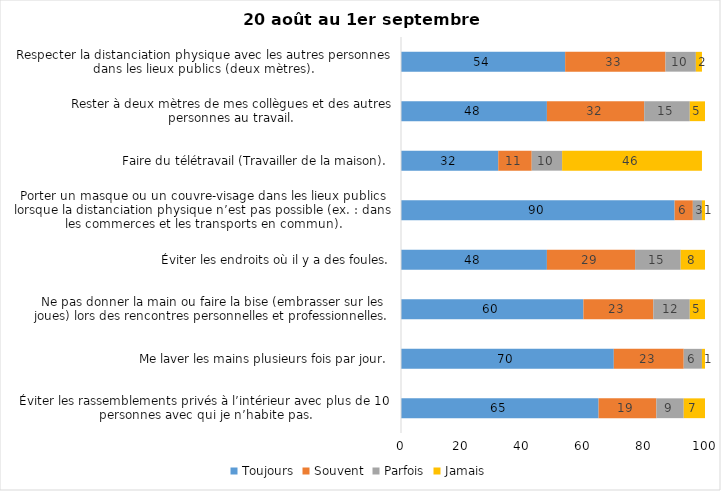
| Category | Toujours | Souvent | Parfois | Jamais |
|---|---|---|---|---|
| Éviter les rassemblements privés à l’intérieur avec plus de 10 personnes avec qui je n’habite pas. | 65 | 19 | 9 | 7 |
| Me laver les mains plusieurs fois par jour. | 70 | 23 | 6 | 1 |
| Ne pas donner la main ou faire la bise (embrasser sur les joues) lors des rencontres personnelles et professionnelles. | 60 | 23 | 12 | 5 |
| Éviter les endroits où il y a des foules. | 48 | 29 | 15 | 8 |
| Porter un masque ou un couvre-visage dans les lieux publics lorsque la distanciation physique n’est pas possible (ex. : dans les commerces et les transports en commun). | 90 | 6 | 3 | 1 |
| Faire du télétravail (Travailler de la maison). | 32 | 11 | 10 | 46 |
| Rester à deux mètres de mes collègues et des autres personnes au travail. | 48 | 32 | 15 | 5 |
| Respecter la distanciation physique avec les autres personnes dans les lieux publics (deux mètres). | 54 | 33 | 10 | 2 |